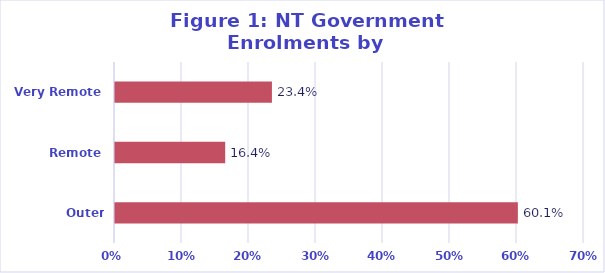
| Category | % |
|---|---|
| Outer Regional | 0.601 |
| Remote | 0.164 |
| Very Remote | 0.234 |